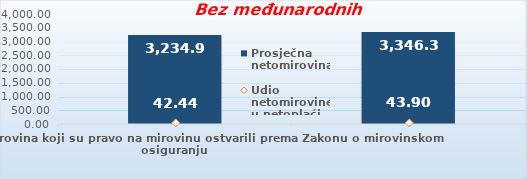
| Category | Prosječna netomirovina  |
|---|---|
| Korisnici mirovina koji su pravo na mirovinu ostvarili prema Zakonu o mirovinskom osiguranju  | 3234.95 |
| Korisnici koji su pravo na mirovinu PRVI PUT ostvarili u 2022. godini prema Zakonu o mirovinskom osiguranju - NOVI KORISNICI | 3346.298 |